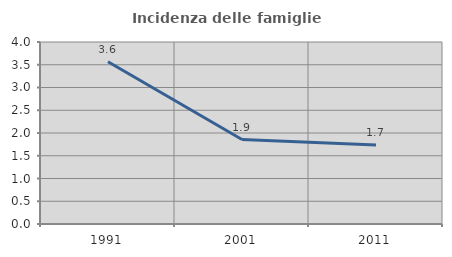
| Category | Incidenza delle famiglie numerose |
|---|---|
| 1991.0 | 3.565 |
| 2001.0 | 1.857 |
| 2011.0 | 1.737 |